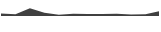
| Category | Series 0 |
|---|---|
| 0 | 0.15 |
| 1 | 0.108 |
| 2 | 0.483 |
| 3 | 0.208 |
| 4 | 0.084 |
| 5 | 0.139 |
| 6 | 0.123 |
| 7 | 0.123 |
| 8 | 0.146 |
| 9 | 0.09 |
| 10 | 0.117 |
| 11 | 0.309 |